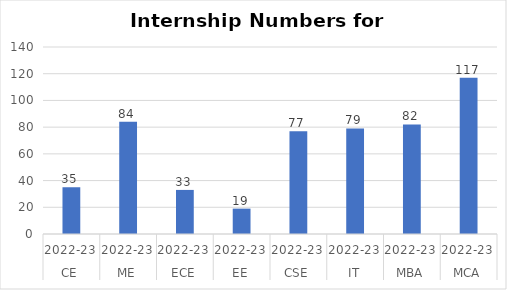
| Category | Internship Numbers |
|---|---|
| 0 | 35 |
| 1 | 84 |
| 2 | 33 |
| 3 | 19 |
| 4 | 77 |
| 5 | 79 |
| 6 | 82 |
| 7 | 117 |